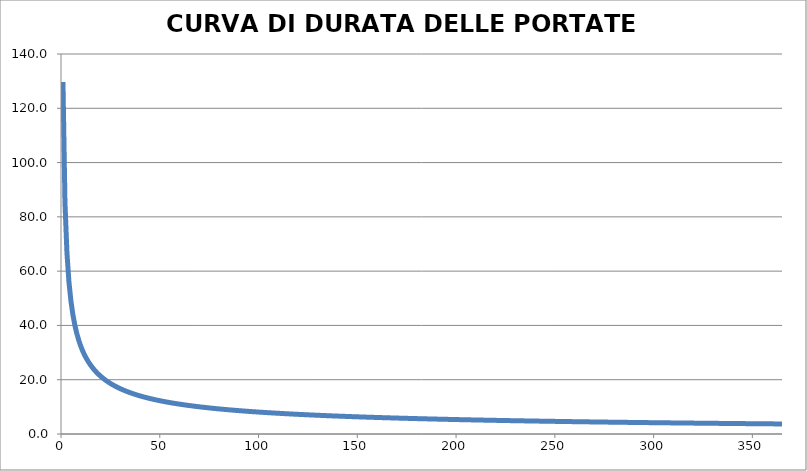
| Category | Series 0 |
|---|---|
| 1.0 | 129.679 |
| 2.0 | 85.398 |
| 3.0 | 66.884 |
| 4.0 | 56.237 |
| 5.0 | 49.161 |
| 6.0 | 44.045 |
| 7.0 | 40.137 |
| 8.0 | 37.034 |
| 9.0 | 34.496 |
| 10.0 | 32.374 |
| 11.0 | 30.567 |
| 12.0 | 29.005 |
| 13.0 | 27.639 |
| 14.0 | 26.432 |
| 15.0 | 25.355 |
| 16.0 | 24.388 |
| 17.0 | 23.513 |
| 18.0 | 22.717 |
| 19.0 | 21.989 |
| 20.0 | 21.319 |
| 21.0 | 20.701 |
| 22.0 | 20.129 |
| 23.0 | 19.597 |
| 24.0 | 19.101 |
| 25.0 | 18.637 |
| 26.0 | 18.201 |
| 27.0 | 17.792 |
| 28.0 | 17.406 |
| 29.0 | 17.042 |
| 30.0 | 16.697 |
| 31.0 | 16.371 |
| 32.0 | 16.06 |
| 33.0 | 15.765 |
| 34.0 | 15.484 |
| 35.0 | 15.216 |
| 36.0 | 14.96 |
| 37.0 | 14.715 |
| 38.0 | 14.48 |
| 39.0 | 14.255 |
| 40.0 | 14.039 |
| 41.0 | 13.832 |
| 42.0 | 13.633 |
| 43.0 | 13.441 |
| 44.0 | 13.256 |
| 45.0 | 13.077 |
| 46.0 | 12.905 |
| 47.0 | 12.739 |
| 48.0 | 12.578 |
| 49.0 | 12.423 |
| 50.0 | 12.273 |
| 51.0 | 12.127 |
| 52.0 | 11.986 |
| 53.0 | 11.849 |
| 54.0 | 11.717 |
| 55.0 | 11.588 |
| 56.0 | 11.462 |
| 57.0 | 11.341 |
| 58.0 | 11.223 |
| 59.0 | 11.108 |
| 60.0 | 10.996 |
| 61.0 | 10.887 |
| 62.0 | 10.78 |
| 63.0 | 10.677 |
| 64.0 | 10.576 |
| 65.0 | 10.478 |
| 66.0 | 10.382 |
| 67.0 | 10.288 |
| 68.0 | 10.197 |
| 69.0 | 10.107 |
| 70.0 | 10.02 |
| 71.0 | 9.935 |
| 72.0 | 9.851 |
| 73.0 | 9.77 |
| 74.0 | 9.69 |
| 75.0 | 9.612 |
| 76.0 | 9.536 |
| 77.0 | 9.461 |
| 78.0 | 9.388 |
| 79.0 | 9.316 |
| 80.0 | 9.245 |
| 81.0 | 9.176 |
| 82.0 | 9.109 |
| 83.0 | 9.042 |
| 84.0 | 8.977 |
| 85.0 | 8.914 |
| 86.0 | 8.851 |
| 87.0 | 8.79 |
| 88.0 | 8.729 |
| 89.0 | 8.67 |
| 90.0 | 8.612 |
| 91.0 | 8.555 |
| 92.0 | 8.499 |
| 93.0 | 8.443 |
| 94.0 | 8.389 |
| 95.0 | 8.336 |
| 96.0 | 8.283 |
| 97.0 | 8.232 |
| 98.0 | 8.181 |
| 99.0 | 8.131 |
| 100.0 | 8.082 |
| 101.0 | 8.034 |
| 102.0 | 7.986 |
| 103.0 | 7.939 |
| 104.0 | 7.893 |
| 105.0 | 7.848 |
| 106.0 | 7.803 |
| 107.0 | 7.759 |
| 108.0 | 7.716 |
| 109.0 | 7.673 |
| 110.0 | 7.631 |
| 111.0 | 7.589 |
| 112.0 | 7.548 |
| 113.0 | 7.508 |
| 114.0 | 7.468 |
| 115.0 | 7.429 |
| 116.0 | 7.39 |
| 117.0 | 7.352 |
| 118.0 | 7.315 |
| 119.0 | 7.278 |
| 120.0 | 7.241 |
| 121.0 | 7.205 |
| 122.0 | 7.169 |
| 123.0 | 7.134 |
| 124.0 | 7.099 |
| 125.0 | 7.065 |
| 126.0 | 7.031 |
| 127.0 | 6.998 |
| 128.0 | 6.965 |
| 129.0 | 6.932 |
| 130.0 | 6.9 |
| 131.0 | 6.868 |
| 132.0 | 6.837 |
| 133.0 | 6.806 |
| 134.0 | 6.775 |
| 135.0 | 6.745 |
| 136.0 | 6.715 |
| 137.0 | 6.685 |
| 138.0 | 6.656 |
| 139.0 | 6.627 |
| 140.0 | 6.599 |
| 141.0 | 6.57 |
| 142.0 | 6.542 |
| 143.0 | 6.515 |
| 144.0 | 6.487 |
| 145.0 | 6.46 |
| 146.0 | 6.434 |
| 147.0 | 6.407 |
| 148.0 | 6.381 |
| 149.0 | 6.355 |
| 150.0 | 6.33 |
| 151.0 | 6.305 |
| 152.0 | 6.28 |
| 153.0 | 6.255 |
| 154.0 | 6.23 |
| 155.0 | 6.206 |
| 156.0 | 6.182 |
| 157.0 | 6.158 |
| 158.0 | 6.135 |
| 159.0 | 6.111 |
| 160.0 | 6.088 |
| 161.0 | 6.066 |
| 162.0 | 6.043 |
| 163.0 | 6.021 |
| 164.0 | 5.998 |
| 165.0 | 5.976 |
| 166.0 | 5.955 |
| 167.0 | 5.933 |
| 168.0 | 5.912 |
| 169.0 | 5.891 |
| 170.0 | 5.87 |
| 171.0 | 5.849 |
| 172.0 | 5.829 |
| 173.0 | 5.808 |
| 174.0 | 5.788 |
| 175.0 | 5.768 |
| 176.0 | 5.748 |
| 177.0 | 5.729 |
| 178.0 | 5.709 |
| 179.0 | 5.69 |
| 180.0 | 5.671 |
| 181.0 | 5.652 |
| 182.0 | 5.634 |
| 183.0 | 5.615 |
| 184.0 | 5.597 |
| 185.0 | 5.578 |
| 186.0 | 5.56 |
| 187.0 | 5.542 |
| 188.0 | 5.524 |
| 189.0 | 5.507 |
| 190.0 | 5.489 |
| 191.0 | 5.472 |
| 192.0 | 5.455 |
| 193.0 | 5.438 |
| 194.0 | 5.421 |
| 195.0 | 5.404 |
| 196.0 | 5.387 |
| 197.0 | 5.371 |
| 198.0 | 5.355 |
| 199.0 | 5.338 |
| 200.0 | 5.322 |
| 201.0 | 5.306 |
| 202.0 | 5.29 |
| 203.0 | 5.275 |
| 204.0 | 5.259 |
| 205.0 | 5.244 |
| 206.0 | 5.228 |
| 207.0 | 5.213 |
| 208.0 | 5.198 |
| 209.0 | 5.183 |
| 210.0 | 5.168 |
| 211.0 | 5.153 |
| 212.0 | 5.139 |
| 213.0 | 5.124 |
| 214.0 | 5.11 |
| 215.0 | 5.095 |
| 216.0 | 5.081 |
| 217.0 | 5.067 |
| 218.0 | 5.053 |
| 219.0 | 5.039 |
| 220.0 | 5.025 |
| 221.0 | 5.011 |
| 222.0 | 4.998 |
| 223.0 | 4.984 |
| 224.0 | 4.971 |
| 225.0 | 4.958 |
| 226.0 | 4.944 |
| 227.0 | 4.931 |
| 228.0 | 4.918 |
| 229.0 | 4.905 |
| 230.0 | 4.892 |
| 231.0 | 4.88 |
| 232.0 | 4.867 |
| 233.0 | 4.854 |
| 234.0 | 4.842 |
| 235.0 | 4.829 |
| 236.0 | 4.817 |
| 237.0 | 4.805 |
| 238.0 | 4.793 |
| 239.0 | 4.78 |
| 240.0 | 4.768 |
| 241.0 | 4.756 |
| 242.0 | 4.745 |
| 243.0 | 4.733 |
| 244.0 | 4.721 |
| 245.0 | 4.71 |
| 246.0 | 4.698 |
| 247.0 | 4.687 |
| 248.0 | 4.675 |
| 249.0 | 4.664 |
| 250.0 | 4.653 |
| 251.0 | 4.641 |
| 252.0 | 4.63 |
| 253.0 | 4.619 |
| 254.0 | 4.608 |
| 255.0 | 4.597 |
| 256.0 | 4.587 |
| 257.0 | 4.576 |
| 258.0 | 4.565 |
| 259.0 | 4.554 |
| 260.0 | 4.544 |
| 261.0 | 4.533 |
| 262.0 | 4.523 |
| 263.0 | 4.513 |
| 264.0 | 4.502 |
| 265.0 | 4.492 |
| 266.0 | 4.482 |
| 267.0 | 4.472 |
| 268.0 | 4.462 |
| 269.0 | 4.452 |
| 270.0 | 4.442 |
| 271.0 | 4.432 |
| 272.0 | 4.422 |
| 273.0 | 4.412 |
| 274.0 | 4.402 |
| 275.0 | 4.393 |
| 276.0 | 4.383 |
| 277.0 | 4.374 |
| 278.0 | 4.364 |
| 279.0 | 4.355 |
| 280.0 | 4.345 |
| 281.0 | 4.336 |
| 282.0 | 4.327 |
| 283.0 | 4.318 |
| 284.0 | 4.308 |
| 285.0 | 4.299 |
| 286.0 | 4.29 |
| 287.0 | 4.281 |
| 288.0 | 4.272 |
| 289.0 | 4.263 |
| 290.0 | 4.254 |
| 291.0 | 4.246 |
| 292.0 | 4.237 |
| 293.0 | 4.228 |
| 294.0 | 4.219 |
| 295.0 | 4.211 |
| 296.0 | 4.202 |
| 297.0 | 4.194 |
| 298.0 | 4.185 |
| 299.0 | 4.177 |
| 300.0 | 4.168 |
| 301.0 | 4.16 |
| 302.0 | 4.152 |
| 303.0 | 4.143 |
| 304.0 | 4.135 |
| 305.0 | 4.127 |
| 306.0 | 4.119 |
| 307.0 | 4.111 |
| 308.0 | 4.103 |
| 309.0 | 4.095 |
| 310.0 | 4.087 |
| 311.0 | 4.079 |
| 312.0 | 4.071 |
| 313.0 | 4.063 |
| 314.0 | 4.055 |
| 315.0 | 4.048 |
| 316.0 | 4.04 |
| 317.0 | 4.032 |
| 318.0 | 4.025 |
| 319.0 | 4.017 |
| 320.0 | 4.009 |
| 321.0 | 4.002 |
| 322.0 | 3.994 |
| 323.0 | 3.987 |
| 324.0 | 3.979 |
| 325.0 | 3.972 |
| 326.0 | 3.965 |
| 327.0 | 3.957 |
| 328.0 | 3.95 |
| 329.0 | 3.943 |
| 330.0 | 3.936 |
| 331.0 | 3.929 |
| 332.0 | 3.921 |
| 333.0 | 3.914 |
| 334.0 | 3.907 |
| 335.0 | 3.9 |
| 336.0 | 3.893 |
| 337.0 | 3.886 |
| 338.0 | 3.879 |
| 339.0 | 3.872 |
| 340.0 | 3.866 |
| 341.0 | 3.859 |
| 342.0 | 3.852 |
| 343.0 | 3.845 |
| 344.0 | 3.838 |
| 345.0 | 3.832 |
| 346.0 | 3.825 |
| 347.0 | 3.818 |
| 348.0 | 3.812 |
| 349.0 | 3.805 |
| 350.0 | 3.799 |
| 351.0 | 3.792 |
| 352.0 | 3.786 |
| 353.0 | 3.779 |
| 354.0 | 3.773 |
| 355.0 | 3.766 |
| 356.0 | 3.76 |
| 357.0 | 3.754 |
| 358.0 | 3.747 |
| 359.0 | 3.741 |
| 360.0 | 3.735 |
| 361.0 | 3.728 |
| 362.0 | 3.722 |
| 363.0 | 3.716 |
| 364.0 | 3.71 |
| 365.0 | 3.704 |